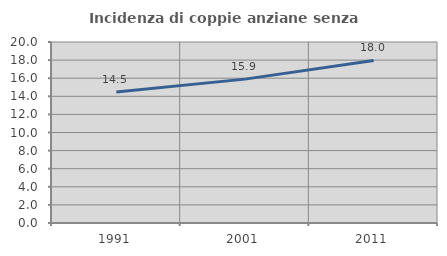
| Category | Incidenza di coppie anziane senza figli  |
|---|---|
| 1991.0 | 14.487 |
| 2001.0 | 15.897 |
| 2011.0 | 17.967 |